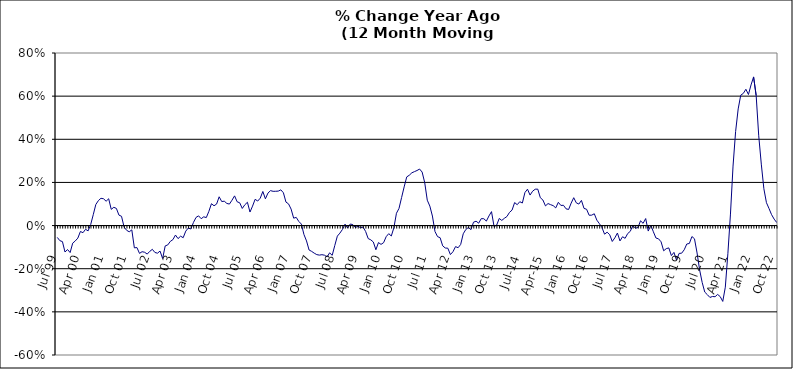
| Category | Series 0 |
|---|---|
| Jul 99 | -0.055 |
| Aug 99 | -0.07 |
| Sep 99 | -0.074 |
| Oct 99 | -0.123 |
| Nov 99 | -0.111 |
| Dec 99 | -0.125 |
| Jan 00 | -0.082 |
| Feb 00 | -0.071 |
| Mar 00 | -0.058 |
| Apr 00 | -0.027 |
| May 00 | -0.033 |
| Jun 00 | -0.017 |
| Jul 00 | -0.025 |
| Aug 00 | 0.005 |
| Sep 00 | 0.05 |
| Oct 00 | 0.098 |
| Nov 00 | 0.116 |
| Dec 00 | 0.127 |
| Jan 01 | 0.124 |
| Feb 01 | 0.113 |
| Mar 01 | 0.124 |
| Apr 01 | 0.075 |
| May 01 | 0.085 |
| Jun 01 | 0.08 |
| Jul 01 | 0.048 |
| Aug 01 | 0.043 |
| Sep 01 | -0.007 |
| Oct 01 | -0.022 |
| Nov 01 | -0.029 |
| Dec 01 | -0.02 |
| Jan 02 | -0.103 |
| Feb 02 | -0.102 |
| Mar 02 | -0.129 |
| Apr 02 | -0.121 |
| May 02 | -0.124 |
| Jun 02 | -0.132 |
| Jul 02 | -0.119 |
| Aug 02 | -0.11 |
| Sep 02 | -0.125 |
| Oct 02 | -0.128 |
| Nov 02 | -0.118 |
| Dec 02 | -0.153 |
| Jan 03 | -0.094 |
| Feb 03 | -0.09 |
| Mar 03 | -0.073 |
| Apr 03 | -0.065 |
| May 03 | -0.044 |
| Jun 03 | -0.06 |
| Jul 03 | -0.049 |
| Aug 03 | -0.056 |
| Sep 03 | -0.026 |
| Oct 03 | -0.012 |
| Nov 03 | -0.016 |
| Dec 03 | 0.014 |
| Jan 04 | 0.038 |
| Feb 04 | 0.045 |
| Mar 04 | 0.032 |
| Apr 04 | 0.041 |
| May 04 | 0.037 |
| Jun 04 | 0.066 |
| Jul 04 | 0.101 |
| Aug 04 | 0.092 |
| Sep 04 | 0.1 |
| Oct 04 | 0.133 |
| Nov 04 | 0.111 |
| Dec 04 | 0.113 |
| Jan 05 | 0.103 |
| Feb 05 | 0.1 |
| Mar 05 | 0.118 |
| Apr 05 | 0.138 |
| May 05 | 0.11 |
| Jun 05 | 0.106 |
| Jul 05 | 0.079 |
| Aug 05 | 0.097 |
| Sep 05 | 0.108 |
| Oct 05 | 0.063 |
| Nov 05 | 0.09 |
| Dec 05 | 0.122 |
| Jan 06 | 0.114 |
| Feb 06 | 0.127 |
| Mar 06 | 0.158 |
| Apr 06 | 0.124 |
| May 06 | 0.151 |
| Jun 06 | 0.162 |
| Jul 06 | 0.159 |
| Aug 06 | 0.159 |
| Sep 06 | 0.16 |
| Oct 06 | 0.166 |
| Nov 06 | 0.152 |
| Dec 06 | 0.109 |
| Jan 07 | 0.101 |
| Feb 07 | 0.076 |
| Mar 07 | 0.034 |
| Apr 07 | 0.038 |
| May 07 | 0.019 |
| Jun 07 | 0.007 |
| Jul 07 | -0.041 |
| Aug 07 | -0.071 |
| Sep 07 | -0.113 |
| Oct 07 | -0.12 |
| Nov 07 | -0.128 |
| Dec 07 | -0.135 |
| Jan 08 | -0.137 |
| Feb 08 | -0.135 |
| Mar 08 | -0.137 |
| Apr 08 | -0.145 |
| May 08 | -0.126 |
| Jun 08 | -0.138 |
| Jul 08 | -0.093 |
| Aug 08 | -0.049 |
| Sep-08 | -0.035 |
| Oct 08 | -0.018 |
| Nov 08 | 0.007 |
| Dec 08 | -0.011 |
| Jan 09 | 0.007 |
| Feb 09 | 0.005 |
| Mar 09 | -0.009 |
| Apr 09 | -0.003 |
| May 09 | -0.01 |
| Jun 09 | -0.007 |
| Jul 09 | -0.027 |
| Aug 09 | -0.06 |
| Sep 09 | -0.066 |
| Oct 09 | -0.076 |
| Nov 09 | -0.112 |
| Dec 09 | -0.079 |
| Jan 10 | -0.087 |
| Feb 10 | -0.079 |
| Mar 10 | -0.052 |
| Apr 10 | -0.037 |
| May 10 | -0.048 |
| Jun 10 | -0.01 |
| Jul 10 | 0.057 |
| Aug 10 | 0.08 |
| Sep 10 | 0.13 |
| Oct 10 | 0.179 |
| Nov 10 | 0.226 |
| Dec 10 | 0.233 |
| Jan 11 | 0.245 |
| Feb 11 | 0.25 |
| Mar 11 | 0.255 |
| Apr 11 | 0.262 |
| May 11 | 0.248 |
| Jun 11 | 0.199 |
| Jul 11 | 0.118 |
| Aug 11 | 0.09 |
| Sep 11 | 0.044 |
| Oct 11 | -0.028 |
| Nov 11 | -0.051 |
| Dec 11 | -0.056 |
| Jan 12 | -0.094 |
| Feb 12 | -0.104 |
| Mar 12 | -0.105 |
| Apr 12 | -0.134 |
| May 12 | -0.121 |
| Jun 12 | -0.098 |
| Jul 12 | -0.103 |
| Aug 12 | -0.087 |
| Sep 12 | -0.038 |
| Oct 12 | -0.018 |
| Nov 12 | -0.009 |
| Dec 12 | -0.019 |
| Jan 13 | 0.016 |
| Feb-13 | 0.02 |
| Mar-13 | 0.011 |
| Apr 13 | 0.032 |
| May 13 | 0.032 |
| Jun-13 | 0.021 |
| Jul 13 | 0.045 |
| Aug 13 | 0.065 |
| Sep 13 | -0.005 |
| Oct 13 | 0.002 |
| Nov 13 | 0.033 |
| Dec 13 | 0.024 |
| Jan 14 | 0.034 |
| Feb-14 | 0.042 |
| Mar 14 | 0.061 |
| Apr 14 | 0.072 |
| May 14 | 0.107 |
| Jun 14 | 0.097 |
| Jul-14 | 0.111 |
| Aug-14 | 0.105 |
| Sep 14 | 0.153 |
| Oct 14 | 0.169 |
| Nov 14 | 0.141 |
| Dec 14 | 0.159 |
| Jan 15 | 0.169 |
| Feb 15 | 0.169 |
| Mar 15 | 0.129 |
| Apr-15 | 0.118 |
| May 15 | 0.091 |
| Jun-15 | 0.102 |
| Jul 15 | 0.097 |
| Aug 15 | 0.092 |
| Sep 15 | 0.082 |
| Oct 15 | 0.108 |
| Nov 15 | 0.093 |
| Dec 15 | 0.094 |
| Jan 16 | 0.078 |
| Feb 16 | 0.075 |
| Mar 16 | 0.104 |
| Apr 16 | 0.129 |
| May 16 | 0.105 |
| Jun 16 | 0.1 |
| Jul 16 | 0.117 |
| Aug 16 | 0.08 |
| Sep 16 | 0.076 |
| Oct 16 | 0.048 |
| Nov 16 | 0.048 |
| Dec 16 | 0.055 |
| Jan 17 | 0.025 |
| Feb 17 | 0.009 |
| Mar 17 | -0.01 |
| Apr 17 | -0.04 |
| May 17 | -0.031 |
| Jun 17 | -0.042 |
| Jul 17 | -0.074 |
| Aug 17 | -0.057 |
| Sep 17 | -0.035 |
| Oct 17 | -0.071 |
| Nov 17 | -0.052 |
| Dec 17 | -0.059 |
| Jan 18 | -0.037 |
| Feb 18 | -0.027 |
| Mar 18 | 0 |
| Apr 18 | -0.012 |
| May 18 | -0.009 |
| Jun 18 | 0.022 |
| Jul 18 | 0.01 |
| Aug 18 | 0.033 |
| Sep 18 | -0.025 |
| Oct 18 | 0.002 |
| Nov 18 | -0.029 |
| Dec 18 | -0.058 |
| Jan 19 | -0.061 |
| Feb 19 | -0.075 |
| Mar 19 | -0.117 |
| Apr 19 | -0.107 |
| May 19 | -0.104 |
| Jun 19 | -0.139 |
| Jul 19 | -0.124 |
| Aug 19 | -0.16 |
| Sep 19 | -0.129 |
| Oct 19 | -0.128 |
| Nov 19 | -0.112 |
| Dec 19 | -0.085 |
| Jan 20 | -0.083 |
| Feb 20 | -0.051 |
| Mar 20 | -0.061 |
| Apr 20 | -0.127 |
| May 20 | -0.206 |
| Jun 20 | -0.264 |
| Jul 20 | -0.308 |
| Aug 20 | -0.32 |
| Sep 20 | -0.333 |
| Oct 20 | -0.329 |
| Nov 20 | -0.33 |
| Dec 20 | -0.319 |
| Jan 21 | -0.329 |
| Feb 21 | -0.352 |
| Mar 21 | -0.286 |
| Apr 21 | -0.129 |
| May 21 | 0.053 |
| Jun 21 | 0.276 |
| Jul 21 | 0.435 |
| Aug 21 | 0.541 |
| Sep 21 | 0.604 |
| Oct 21 | 0.613 |
| Nov 21 | 0.632 |
| Dec 21 | 0.608 |
| Jan 22 | 0.652 |
| Feb 22 | 0.689 |
| Mar 22 | 0.603 |
| Apr 22 | 0.416 |
| May 22 | 0.285 |
| Jun 22 | 0.171 |
| Jul 22 | 0.106 |
| Aug 22 | 0.079 |
| Sep 22 | 0.051 |
| Oct 22 | 0.03 |
| Nov 22 | 0.014 |